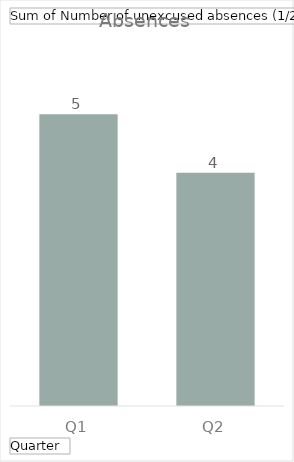
| Category | Total |
|---|---|
| Q1 | 5 |
| Q2 | 4 |